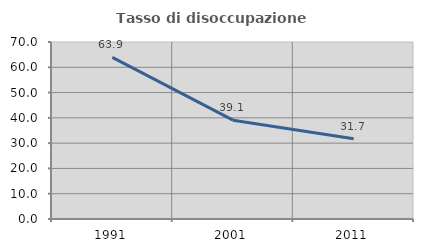
| Category | Tasso di disoccupazione giovanile  |
|---|---|
| 1991.0 | 63.889 |
| 2001.0 | 39.073 |
| 2011.0 | 31.722 |